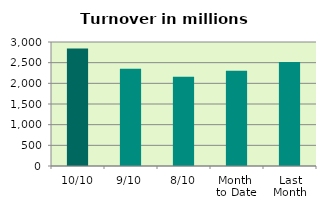
| Category | Series 0 |
|---|---|
| 10/10 | 2843.722 |
| 9/10 | 2354.914 |
| 8/10 | 2158.291 |
| Month 
to Date | 2305.587 |
| Last
Month | 2513.15 |